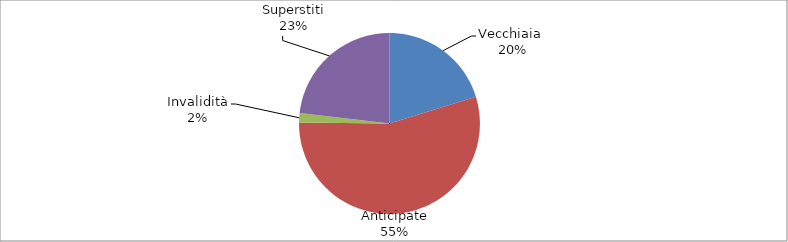
| Category | Series 0 |
|---|---|
| Vecchiaia  | 20113 |
| Anticipate | 54726 |
| Invalidità | 1671 |
| Superstiti | 23052 |